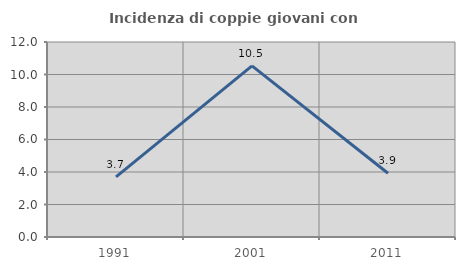
| Category | Incidenza di coppie giovani con figli |
|---|---|
| 1991.0 | 3.704 |
| 2001.0 | 10.526 |
| 2011.0 | 3.922 |